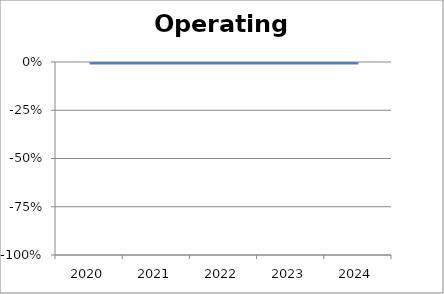
| Category | Operating margin |
|---|---|
| 2020.0 | 0 |
| 2021.0 | 0 |
| 2022.0 | 0 |
| 2023.0 | 0 |
| 2024.0 | 0 |